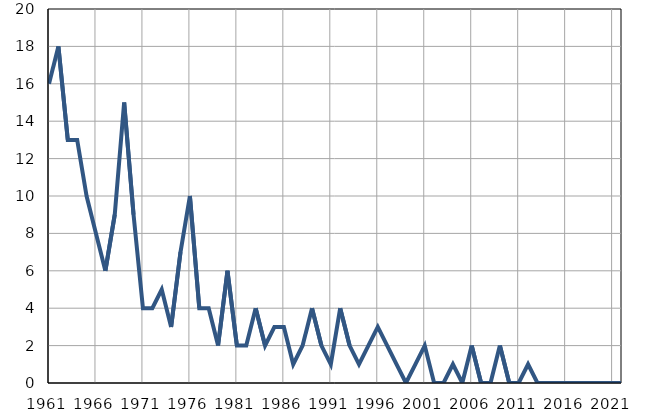
| Category | Умрла 
одојчад |
|---|---|
| 1961.0 | 16 |
| 1962.0 | 18 |
| 1963.0 | 13 |
| 1964.0 | 13 |
| 1965.0 | 10 |
| 1966.0 | 8 |
| 1967.0 | 6 |
| 1968.0 | 9 |
| 1969.0 | 15 |
| 1970.0 | 9 |
| 1971.0 | 4 |
| 1972.0 | 4 |
| 1973.0 | 5 |
| 1974.0 | 3 |
| 1975.0 | 7 |
| 1976.0 | 10 |
| 1977.0 | 4 |
| 1978.0 | 4 |
| 1979.0 | 2 |
| 1980.0 | 6 |
| 1981.0 | 2 |
| 1982.0 | 2 |
| 1983.0 | 4 |
| 1984.0 | 2 |
| 1985.0 | 3 |
| 1986.0 | 3 |
| 1987.0 | 1 |
| 1988.0 | 2 |
| 1989.0 | 4 |
| 1990.0 | 2 |
| 1991.0 | 1 |
| 1992.0 | 4 |
| 1993.0 | 2 |
| 1994.0 | 1 |
| 1995.0 | 2 |
| 1996.0 | 3 |
| 1997.0 | 2 |
| 1998.0 | 1 |
| 1999.0 | 0 |
| 2000.0 | 1 |
| 2001.0 | 2 |
| 2002.0 | 0 |
| 2003.0 | 0 |
| 2004.0 | 1 |
| 2005.0 | 0 |
| 2006.0 | 2 |
| 2007.0 | 0 |
| 2008.0 | 0 |
| 2009.0 | 2 |
| 2010.0 | 0 |
| 2011.0 | 0 |
| 2012.0 | 1 |
| 2013.0 | 0 |
| 2014.0 | 0 |
| 2015.0 | 0 |
| 2016.0 | 0 |
| 2017.0 | 0 |
| 2018.0 | 0 |
| 2019.0 | 0 |
| 2020.0 | 0 |
| 2021.0 | 0 |
| 2022.0 | 0 |